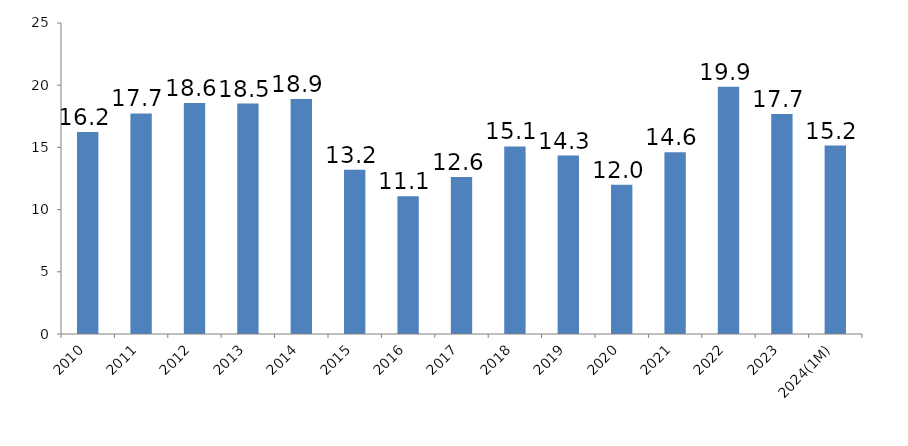
| Category | Value of Imported Energy : Total Import (%) |
|---|---|
| 2010 | 16.24 |
| 2011 | 17.73 |
| 2012 | 18.57 |
| 2013 | 18.52 |
| 2014 | 18.9 |
| 2015 | 13.2 |
| 2016 | 11.07 |
| 2017 | 12.63 |
| 2018 | 15.08 |
| 2019 | 14.34 |
| 2020 | 12 |
| 2021 | 14.61 |
| 2022 | 19.87 |
| 2023 | 17.69 |
| 2024(1M) | 15.15 |